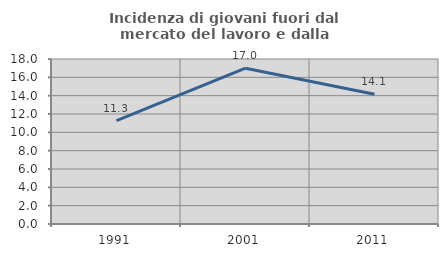
| Category | Incidenza di giovani fuori dal mercato del lavoro e dalla formazione  |
|---|---|
| 1991.0 | 11.287 |
| 2001.0 | 16.997 |
| 2011.0 | 14.148 |